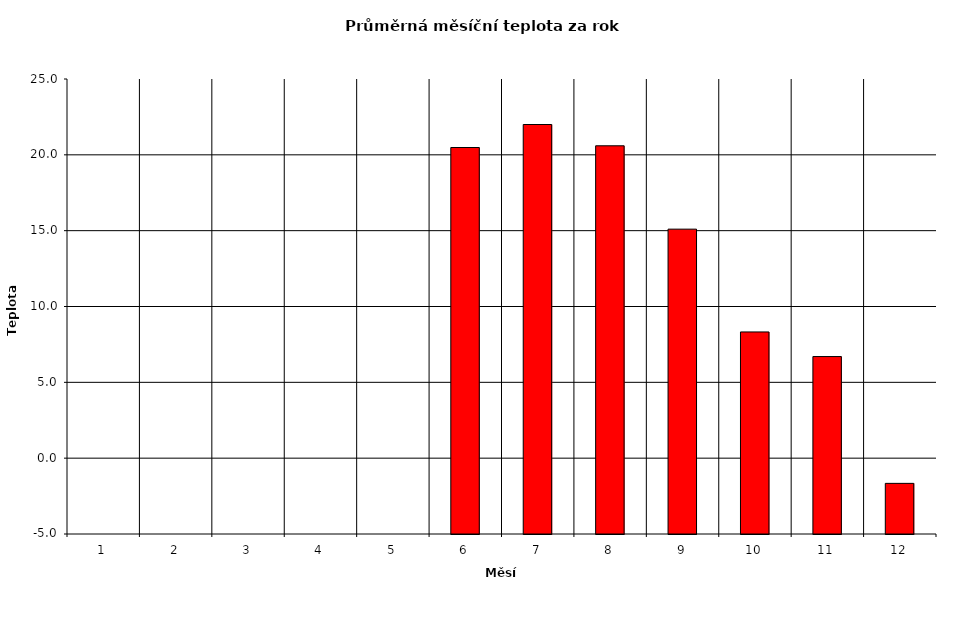
| Category | -5,0 -5,0 -5,0 -5,0 -5,0 |
|---|---|
| 1.0 | -5 |
| 2.0 | -5 |
| 3.0 | -5 |
| 4.0 | -5 |
| 5.0 | -5 |
| 6.0 | 20.483 |
| 7.0 | 22 |
| 8.0 | 20.597 |
| 9.0 | 15.1 |
| 10.0 | 8.323 |
| 11.0 | 6.7 |
| 12.0 | -1.661 |